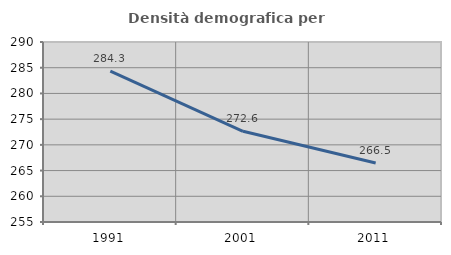
| Category | Densità demografica |
|---|---|
| 1991.0 | 284.341 |
| 2001.0 | 272.635 |
| 2011.0 | 266.474 |